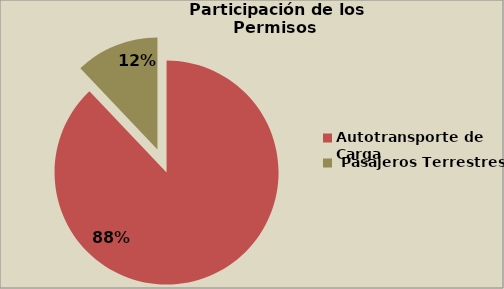
| Category | Series 0 |
|---|---|
| Autotransporte de Carga  | 87.919 |
|  Pasajeros Terrestres | 12.081 |